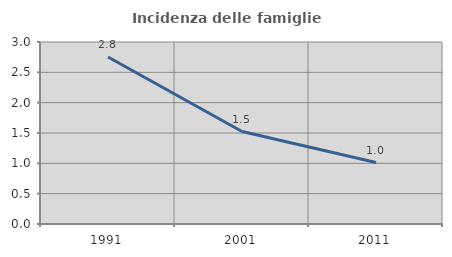
| Category | Incidenza delle famiglie numerose |
|---|---|
| 1991.0 | 2.752 |
| 2001.0 | 1.524 |
| 2011.0 | 1.012 |